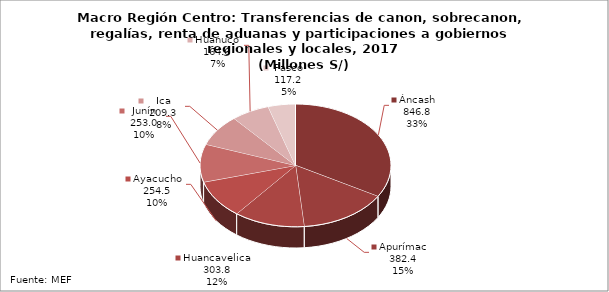
| Category | Series 0 |
|---|---|
| Áncash | 846.846 |
| Apurímac | 382.443 |
| Huancavelica | 303.799 |
| Ayacucho | 254.453 |
| Junín | 253.029 |
| Ica | 209.268 |
| Huánuco | 164.568 |
| Pasco | 117.153 |